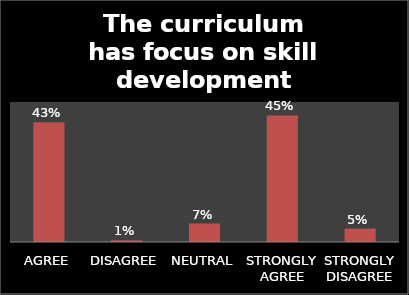
| Category | Series 0 |
|---|---|
| AGREE | 0.428 |
| DISAGREE | 0.006 |
| NEUTRAL | 0.066 |
| STRONGLY AGREE | 0.452 |
| STRONGLY DISAGREE | 0.048 |